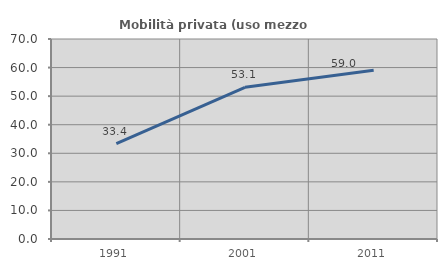
| Category | Mobilità privata (uso mezzo privato) |
|---|---|
| 1991.0 | 33.376 |
| 2001.0 | 53.099 |
| 2011.0 | 59.024 |